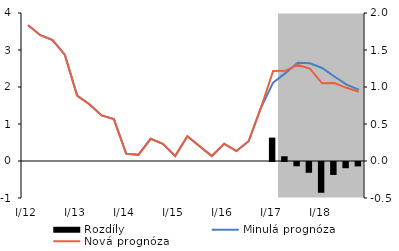
| Category | Rozdíly |
|---|---|
| I/12 | 0 |
| II | 0 |
| III | 0 |
| IV | 0 |
| I/13 | 0 |
| II | 0 |
| III | 0 |
| IV | 0 |
| I/14 | 0 |
| II | 0 |
| III | 0 |
| IV | 0 |
| I/15 | 0 |
| II | 0 |
| III | 0 |
| IV | 0 |
| I/16 | 0 |
| II | 0 |
| III | 0 |
| IV | 0 |
| I/17 | 0.316 |
| II | 0.064 |
| III | -0.058 |
| IV | -0.145 |
| I/18 | -0.416 |
| II | -0.176 |
| III | -0.084 |
| IV | -0.059 |